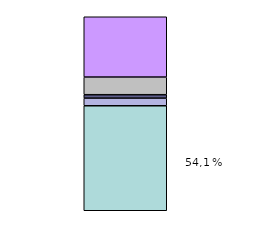
| Category | Series 0 | Series 1 | Series 2 | Series 3 | Series 4 |
|---|---|---|---|---|---|
| 0 | 151154.213 | 11011.68 | 4901.064 | 25441.13 | 86805.723 |